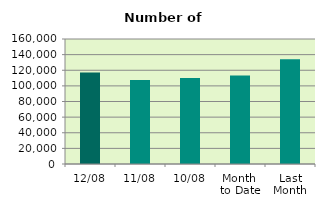
| Category | Series 0 |
|---|---|
| 12/08 | 117240 |
| 11/08 | 107654 |
| 10/08 | 110036 |
| Month 
to Date | 113159.2 |
| Last
Month | 134197.333 |